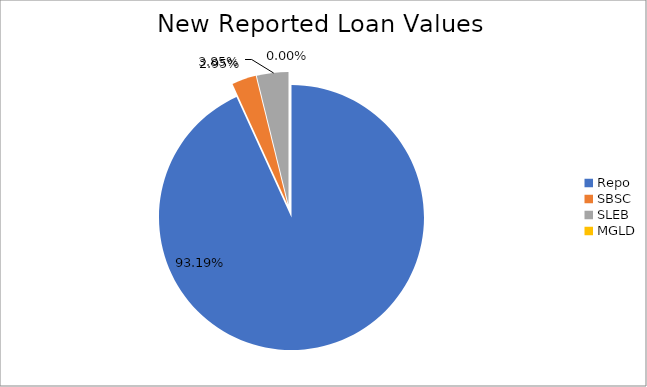
| Category | Series 0 |
|---|---|
| Repo | 9070755.68 |
| SBSC | 287617.961 |
| SLEB | 374789.61 |
| MGLD | 261.839 |